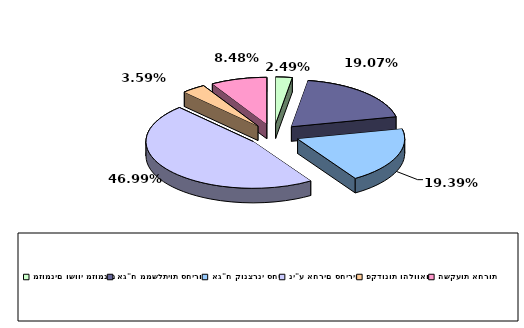
| Category | Series 0 |
|---|---|
| מזומנים ושווי מזומנים | 0.025 |
| אג"ח ממשלתיות סחירות | 0.191 |
| אג"ח קונצרני סחיר | 0.194 |
| ני"ע אחרים סחירים | 0.47 |
| פקדונות והלוואות | 0.036 |
| השקעות אחרות | 0.085 |